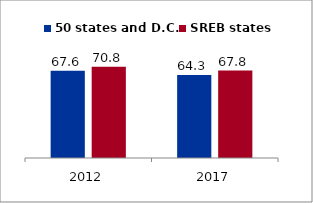
| Category | 50 states and D.C. | SREB states |
|---|---|---|
| 2012.0 | 67.611 | 70.822 |
| 2017.0 | 64.269 | 67.807 |